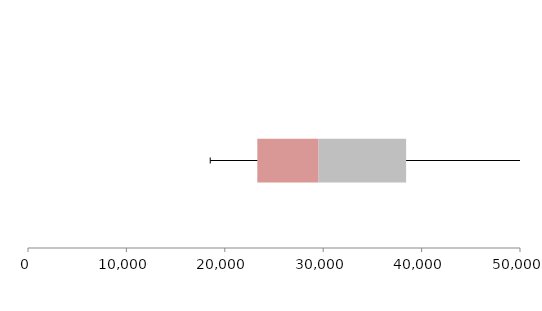
| Category | Series 1 | Series 2 | Series 3 |
|---|---|---|---|
| 0 | 23304.2 | 6226.514 | 8894.857 |